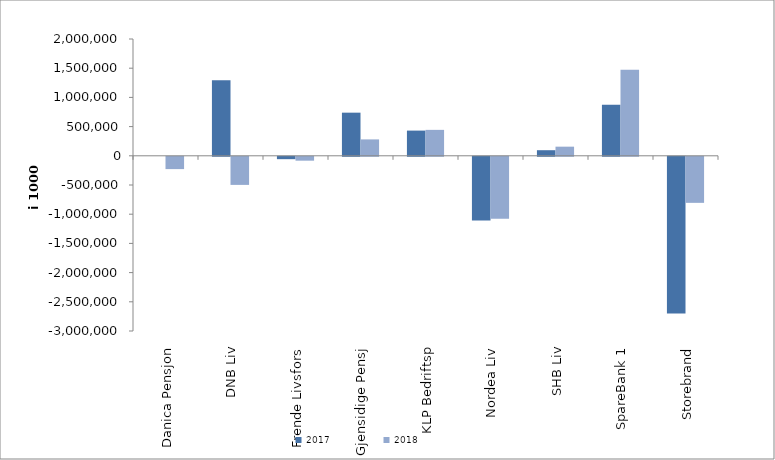
| Category | 2017 | 2018 |
|---|---|---|
| Danica Pensjon | 0 | -210577.098 |
| DNB Liv | 1294346 | -481067 |
| Frende Livsfors | -40663.235 | -66404 |
| Gjensidige Pensj | 738595 | 280691 |
| KLP Bedriftsp | 431562 | 444032 |
| Nordea Liv | -1089161.438 | -1061165.384 |
| SHB Liv | 95800.697 | 156380 |
| SpareBank 1 | 875736.415 | 1474548.051 |
| Storebrand | -2684655.31 | -788494.157 |